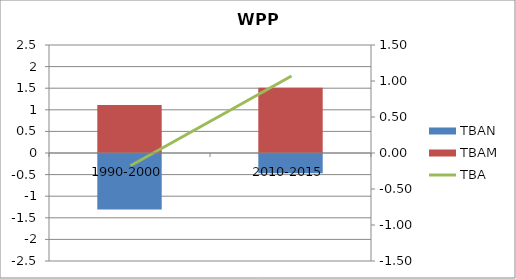
| Category | TBAN | TBAM |
|---|---|---|
| 1990-2000 | -1.287 | 1.11 |
| 2010-2015 | -0.444 | 1.513 |